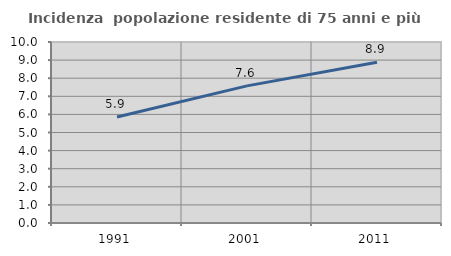
| Category | Incidenza  popolazione residente di 75 anni e più |
|---|---|
| 1991.0 | 5.853 |
| 2001.0 | 7.576 |
| 2011.0 | 8.886 |